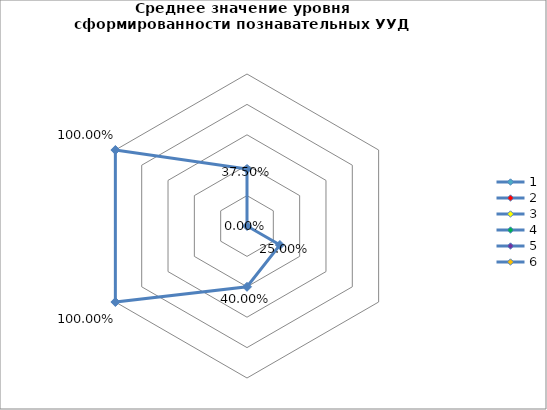
| Category | Series 0 |
|---|---|
| 0 | 0.375 |
| 1 | 0 |
| 2 | 0.25 |
| 3 | 0.4 |
| 4 | 1 |
| 5 | 1 |